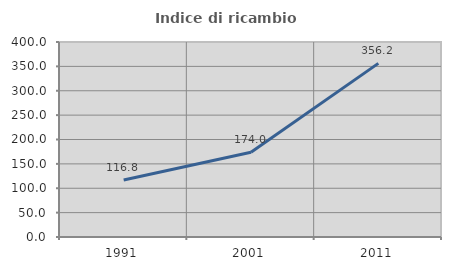
| Category | Indice di ricambio occupazionale  |
|---|---|
| 1991.0 | 116.76 |
| 2001.0 | 174.014 |
| 2011.0 | 356.186 |